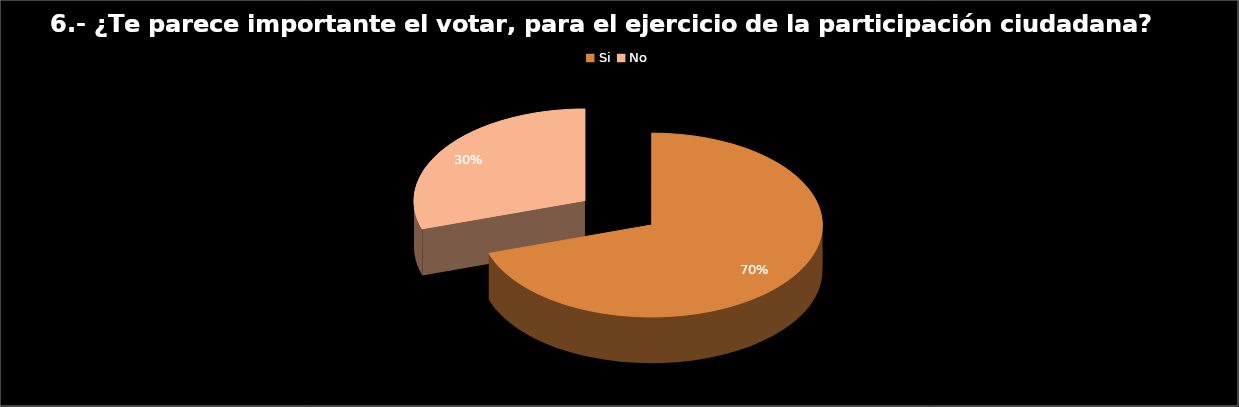
| Category | Series 0 |
|---|---|
| Si  | 56 |
| No | 24 |